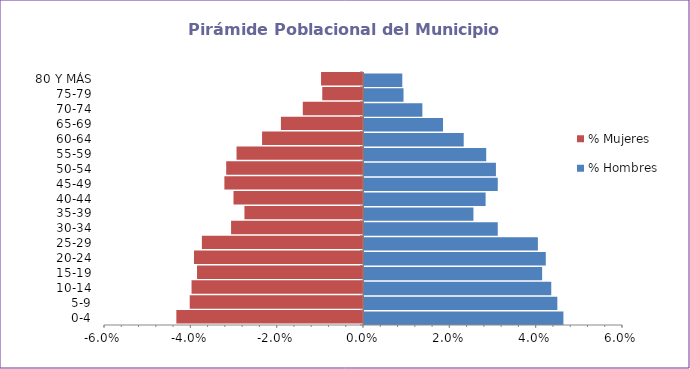
| Category | % Hombres | % Mujeres |
|---|---|---|
| 0-4 | 0.046 | -0.043 |
| 5-9 | 0.045 | -0.04 |
| 10-14 | 0.043 | -0.04 |
| 15-19 | 0.041 | -0.038 |
| 20-24 | 0.042 | -0.039 |
| 25-29 | 0.04 | -0.037 |
| 30-34 | 0.031 | -0.031 |
| 35-39 | 0.025 | -0.027 |
| 40-44 | 0.028 | -0.03 |
| 45-49 | 0.031 | -0.032 |
| 50-54 | 0.031 | -0.032 |
| 55-59 | 0.028 | -0.029 |
| 60-64 | 0.023 | -0.023 |
| 65-69 | 0.018 | -0.019 |
| 70-74 | 0.014 | -0.014 |
| 75-79 | 0.009 | -0.009 |
| 80 Y MÁS | 0.009 | -0.01 |